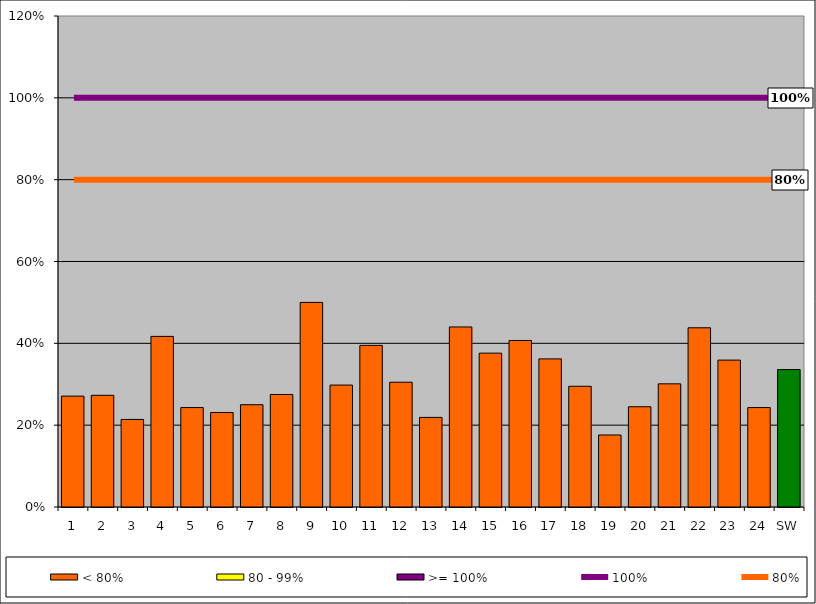
| Category | < 80% | 80 - 99% | >= 100% |
|---|---|---|---|
| 1 | 0.271 | 0 | 0 |
| 2 | 0.273 | 0 | 0 |
| 3 | 0.214 | 0 | 0 |
| 4 | 0.417 | 0 | 0 |
| 5 | 0.243 | 0 | 0 |
| 6 | 0.231 | 0 | 0 |
| 7 | 0.25 | 0 | 0 |
| 8 | 0.275 | 0 | 0 |
| 9 | 0.5 | 0 | 0 |
| 10 | 0.298 | 0 | 0 |
| 11 | 0.395 | 0 | 0 |
| 12 | 0.305 | 0 | 0 |
| 13 | 0.219 | 0 | 0 |
| 14 | 0.44 | 0 | 0 |
| 15 | 0.376 | 0 | 0 |
| 16 | 0.407 | 0 | 0 |
| 17 | 0.362 | 0 | 0 |
| 18 | 0.295 | 0 | 0 |
| 19 | 0.176 | 0 | 0 |
| 20 | 0.245 | 0 | 0 |
| 21 | 0.301 | 0 | 0 |
| 22 | 0.438 | 0 | 0 |
| 23 | 0.359 | 0 | 0 |
| 24 | 0.243 | 0 | 0 |
| SW | 0.336 | 0 | 0 |